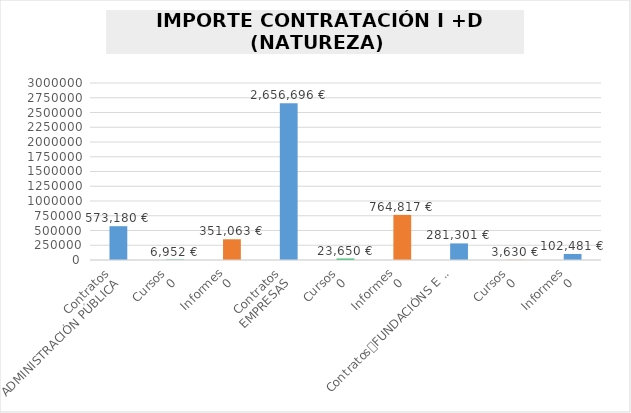
| Category | Series 0 |
|---|---|
| 0 | 573180 |
| 1 | 6952 |
| 2 | 351063 |
| 3 | 2656696 |
| 4 | 23650 |
| 5 | 764817 |
| 6 | 281301 |
| 7 | 3630 |
| 8 | 102481 |